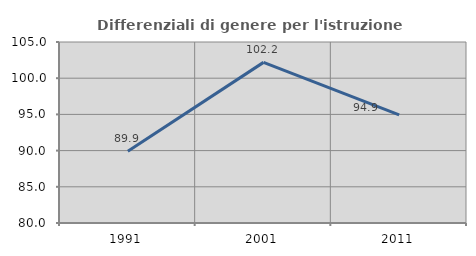
| Category | Differenziali di genere per l'istruzione superiore |
|---|---|
| 1991.0 | 89.903 |
| 2001.0 | 102.186 |
| 2011.0 | 94.943 |